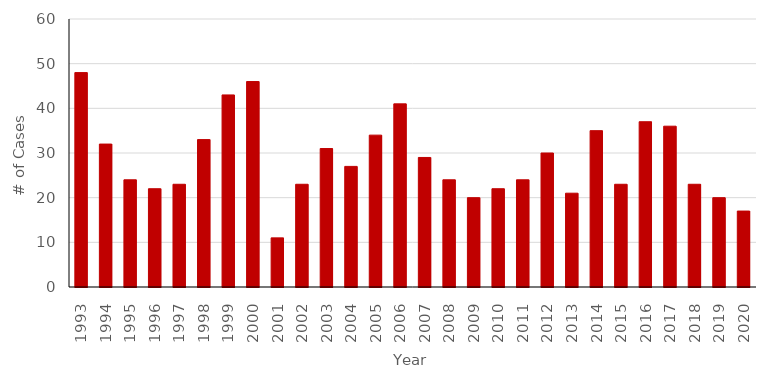
| Category | # Cases |
|---|---|
| 1993.0 | 48 |
| 1994.0 | 32 |
| 1995.0 | 24 |
| 1996.0 | 22 |
| 1997.0 | 23 |
| 1998.0 | 33 |
| 1999.0 | 43 |
| 2000.0 | 46 |
| 2001.0 | 11 |
| 2002.0 | 23 |
| 2003.0 | 31 |
| 2004.0 | 27 |
| 2005.0 | 34 |
| 2006.0 | 41 |
| 2007.0 | 29 |
| 2008.0 | 24 |
| 2009.0 | 20 |
| 2010.0 | 22 |
| 2011.0 | 24 |
| 2012.0 | 30 |
| 2013.0 | 21 |
| 2014.0 | 35 |
| 2015.0 | 23 |
| 2016.0 | 37 |
| 2017.0 | 36 |
| 2018.0 | 23 |
| 2019.0 | 20 |
| 2020.0 | 17 |